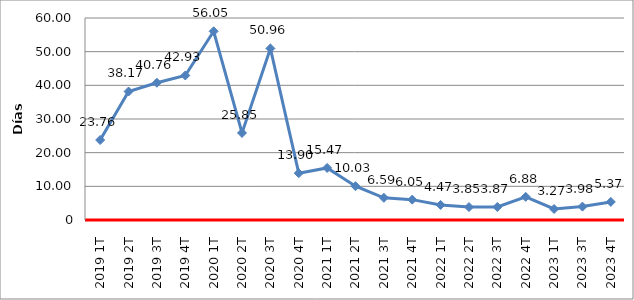
| Category | Total |
|---|---|
| 2019 1T | 23.76 |
| 2019 2T | 38.17 |
| 2019 3T | 40.76 |
| 2019 4T | 42.93 |
| 2020 1T | 56.05 |
| 2020 2T | 25.85 |
| 2020 3T | 50.96 |
| 2020 4T | 13.9 |
| 2021 1T | 15.47 |
| 2021 2T | 10.03 |
| 2021 3T | 6.59 |
| 2021 4T | 6.05 |
| 2022 1T | 4.47 |
| 2022 2T | 3.85 |
| 2022 3T | 3.87 |
| 2022 4T | 6.88 |
| 2023 1T | 3.27 |
| 2023 3T | 3.98 |
| 2023 4T | 5.37 |